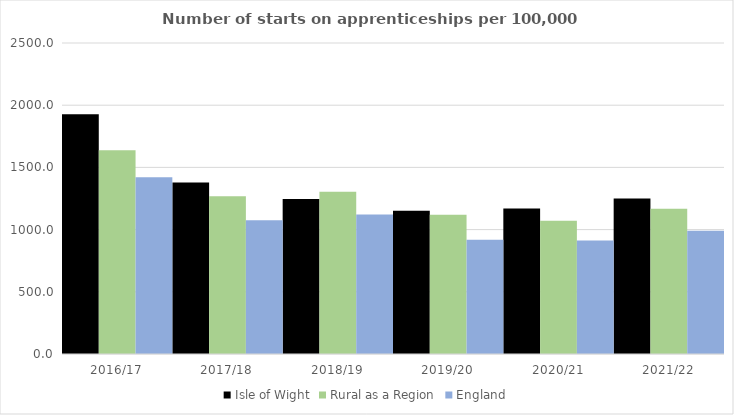
| Category | Isle of Wight | Rural as a Region | England |
|---|---|---|---|
| 2016/17 | 1927 | 1638.789 | 1420 |
| 2017/18 | 1378 | 1267.474 | 1075 |
| 2018/19 | 1246 | 1304.57 | 1122 |
| 2019/20 | 1151 | 1119.662 | 918 |
| 2020/21 | 1170 | 1070.748 | 912 |
| 2021/22 | 1249 | 1167.68 | 991 |